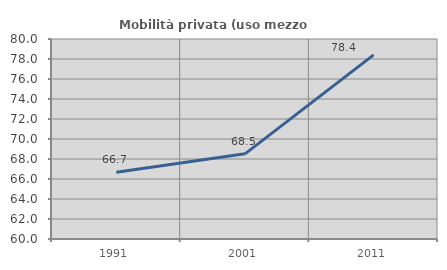
| Category | Mobilità privata (uso mezzo privato) |
|---|---|
| 1991.0 | 66.667 |
| 2001.0 | 68.519 |
| 2011.0 | 78.409 |